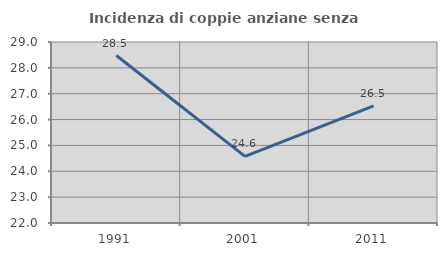
| Category | Incidenza di coppie anziane senza figli  |
|---|---|
| 1991.0 | 28.477 |
| 2001.0 | 24.576 |
| 2011.0 | 26.531 |